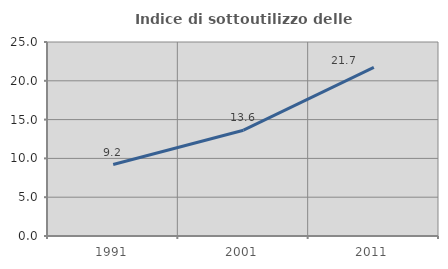
| Category | Indice di sottoutilizzo delle abitazioni  |
|---|---|
| 1991.0 | 9.206 |
| 2001.0 | 13.632 |
| 2011.0 | 21.722 |